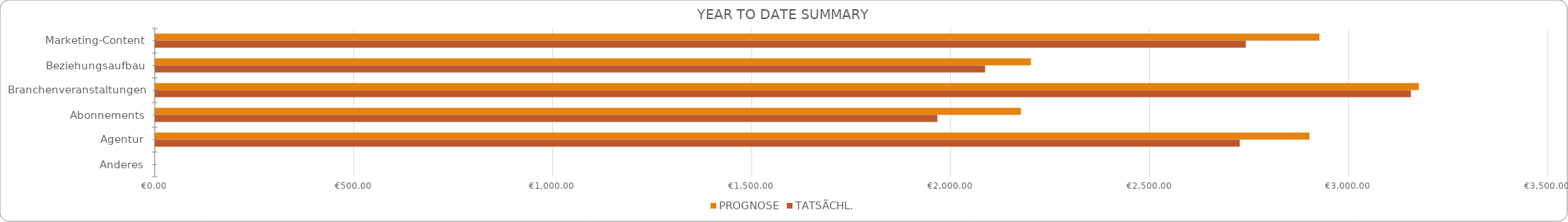
| Category | PROGNOSE | TATSÄCHL. |
|---|---|---|
| Marketing-Content | 2925 | 2740 |
| Beziehungsaufbau | 2200 | 2085 |
| Branchenveranstaltungen | 3175 | 3155 |
| Abonnements | 2175 | 1965 |
| Agentur | 2900 | 2725 |
| Anderes | 0 | 0 |